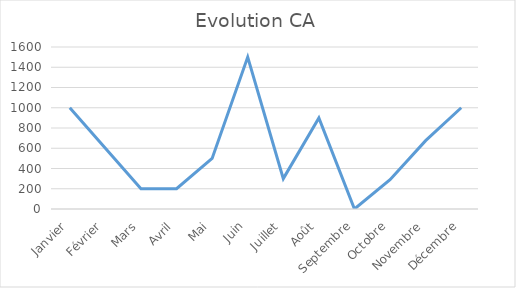
| Category | Series 0 |
|---|---|
| Janvier | 1000 |
| Février | 600 |
| Mars | 200 |
| Avril | 200 |
| Mai | 500 |
| Juin | 1500 |
| Juillet | 300 |
| Août | 900 |
| Septembre | 0 |
| Octobre | 289 |
| Novembre | 675 |
| Décembre | 1000 |